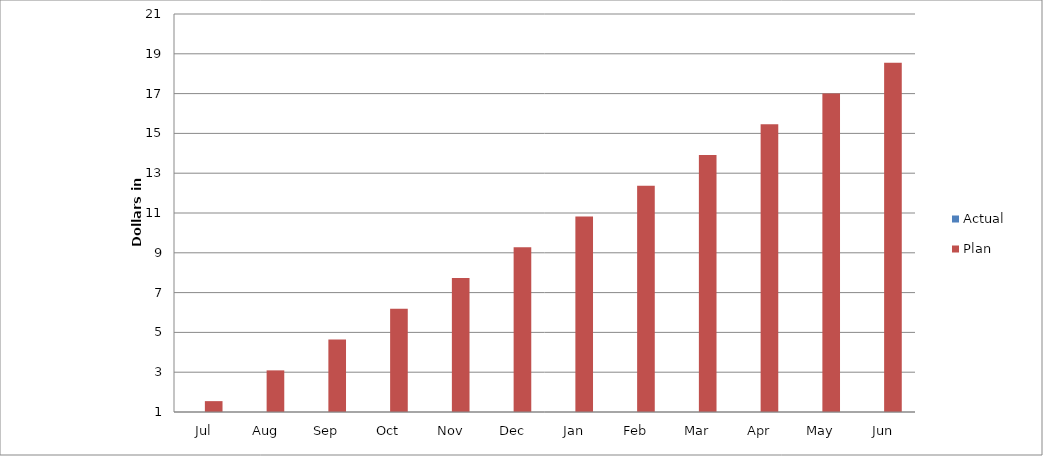
| Category | Actual | Plan |
|---|---|---|
| Jul | 0 | 1545979.5 |
| Aug | 0 | 3091959 |
| Sep | 0 | 4637938.5 |
| Oct | 0 | 6183918 |
| Nov | 0 | 7729897.5 |
| Dec | 0 | 9275877 |
| Jan | 0 | 10821856.5 |
| Feb | 0 | 12367836 |
| Mar | 0 | 13913815.5 |
| Apr | 0 | 15459795 |
| May | 0 | 17005774.5 |
| Jun | 0 | 18551754 |